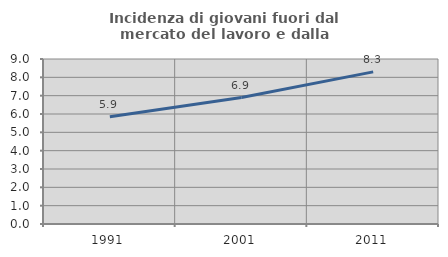
| Category | Incidenza di giovani fuori dal mercato del lavoro e dalla formazione  |
|---|---|
| 1991.0 | 5.852 |
| 2001.0 | 6.897 |
| 2011.0 | 8.298 |